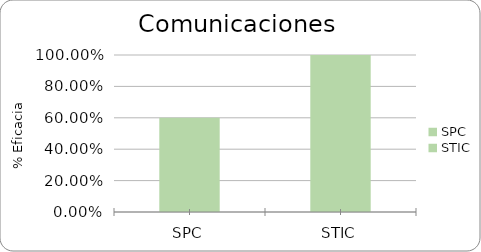
| Category | % Eficacia total |
|---|---|
| SPC | 0.6 |
| STIC | 1 |